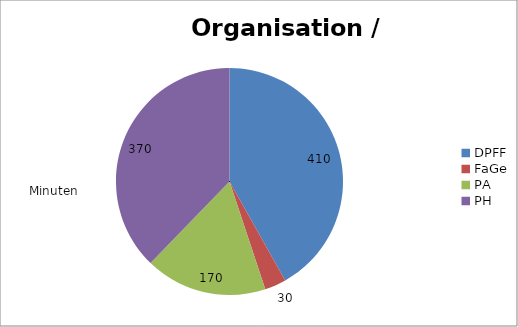
| Category | Organisation / Koordination |
|---|---|
| DPFF | 410 |
| FaGe | 30 |
| PA | 170 |
| PH | 370 |